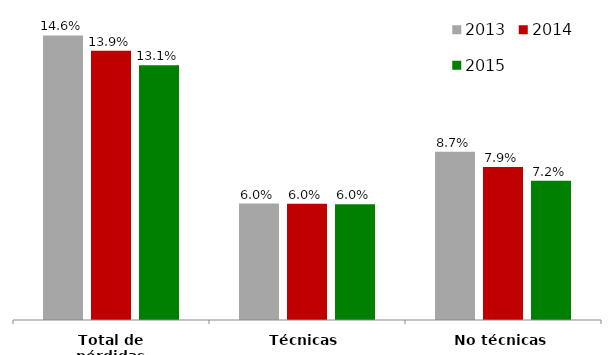
| Category | 2013 | 2014 | 2015 |
|---|---|---|---|
| Total de pérdidas | 0.146 | 0.138 | 0.131 |
| Técnicas | 0.06 | 0.06 | 0.06 |
| No técnicas | 0.086 | 0.079 | 0.072 |